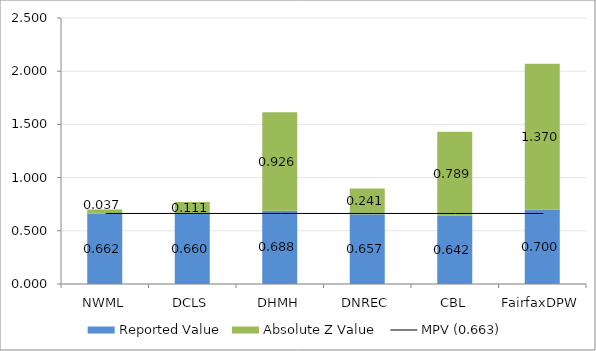
| Category | Reported Value | Absolute Z Value  |
|---|---|---|
| NWML | 0.662 | 0.037 |
| DCLS | 0.66 | 0.111 |
| DHMH | 0.688 | 0.926 |
| DNREC | 0.656 | 0.241 |
| CBL | 0.642 | 0.789 |
| FairfaxDPW | 0.7 | 1.37 |